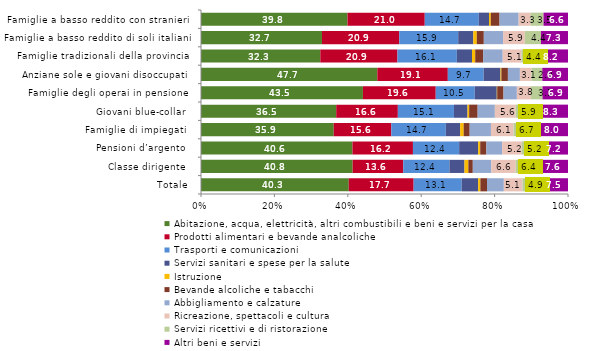
| Category | Abitazione, acqua, elettricità, altri combustibili e beni e servizi per la casa | Prodotti alimentari e bevande analcoliche | Trasporti e comunicazioni | Servizi sanitari e spese per la salute | Istruzione | Bevande alcoliche e tabacchi | Abbigliamento e calzature | Ricreazione, spettacoli e cultura | Servizi ricettivi e di ristorazione | Altri beni e servizi |
|---|---|---|---|---|---|---|---|---|---|---|
| Totale | 40.3 | 17.7 | 13.1 | 4.5 | 0.6 | 1.8 | 4.6 | 5.1 | 4.9 | 7.5 |
| Classe dirigente  | 40.807 | 13.602 | 12.439 | 4.046 | 1.038 | 1.2 | 4.974 | 6.566 | 6.445 | 7.629 |
| Pensioni d’argento  | 40.578 | 16.21 | 12.382 | 5.107 | 0.537 | 1.647 | 4.207 | 5.225 | 5.236 | 7.201 |
| Famiglie di impiegati  | 35.866 | 15.563 | 14.733 | 3.881 | 0.941 | 1.625 | 5.747 | 6.113 | 6.695 | 8.013 |
| Giovani blue-collar  | 36.502 | 16.638 | 15.15 | 3.658 | 0.446 | 2.29 | 4.646 | 5.613 | 5.854 | 8.28 |
| Famiglie degli operai in pensione  | 43.544 | 19.578 | 10.491 | 5.923 | 0.118 | 1.694 | 3.592 | 3.78 | 3.113 | 6.853 |
| Anziane sole e giovani disoccupati  | 47.736 | 19.084 | 9.699 | 4.553 | 0.251 | 1.763 | 3.252 | 3.144 | 2.926 | 6.949 |
| Famiglie tradizionali della provincia  | 32.313 | 20.899 | 16.082 | 4.108 | 0.863 | 2.136 | 5.312 | 5.09 | 4.38 | 8.214 |
| Famiglie a basso reddito di soli italiani  | 32.694 | 20.888 | 15.92 | 4.07 | 0.947 | 1.903 | 5.211 | 5.855 | 4.372 | 7.309 |
| Famiglie a basso reddito con stranieri  | 39.81 | 21.002 | 14.683 | 2.787 | 0.473 | 2.381 | 5.194 | 3.271 | 3.491 | 6.647 |